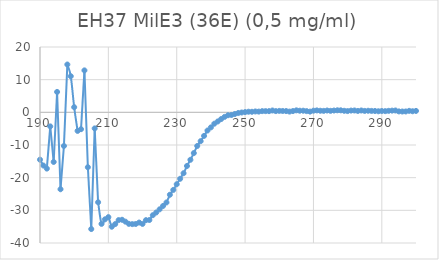
| Category | Series 0 |
|---|---|
| 300.0 | 0.434 |
| 299.0 | 0.333 |
| 298.0 | 0.453 |
| 297.0 | 0.268 |
| 296.0 | 0.253 |
| 295.0 | 0.283 |
| 294.0 | 0.562 |
| 293.0 | 0.522 |
| 292.0 | 0.46 |
| 291.0 | 0.37 |
| 290.0 | 0.409 |
| 289.0 | 0.327 |
| 288.0 | 0.41 |
| 287.0 | 0.438 |
| 286.0 | 0.484 |
| 285.0 | 0.439 |
| 284.0 | 0.565 |
| 283.0 | 0.428 |
| 282.0 | 0.567 |
| 281.0 | 0.538 |
| 280.0 | 0.386 |
| 279.0 | 0.468 |
| 278.0 | 0.617 |
| 277.0 | 0.626 |
| 276.0 | 0.554 |
| 275.0 | 0.46 |
| 274.0 | 0.56 |
| 273.0 | 0.45 |
| 272.0 | 0.486 |
| 271.0 | 0.59 |
| 270.0 | 0.504 |
| 269.0 | 0.223 |
| 268.0 | 0.378 |
| 267.0 | 0.495 |
| 266.0 | 0.495 |
| 265.0 | 0.607 |
| 264.0 | 0.387 |
| 263.0 | 0.23 |
| 262.0 | 0.389 |
| 261.0 | 0.413 |
| 260.0 | 0.44 |
| 259.0 | 0.376 |
| 258.0 | 0.56 |
| 257.0 | 0.361 |
| 256.0 | 0.366 |
| 255.0 | 0.368 |
| 254.0 | 0.226 |
| 253.0 | 0.263 |
| 252.0 | 0.168 |
| 251.0 | 0.189 |
| 250.0 | 0.073 |
| 249.0 | -0.053 |
| 248.0 | -0.197 |
| 247.0 | -0.514 |
| 246.0 | -0.811 |
| 245.0 | -0.896 |
| 244.0 | -1.393 |
| 243.0 | -2.061 |
| 242.0 | -2.797 |
| 241.0 | -3.478 |
| 240.0 | -4.607 |
| 239.0 | -5.567 |
| 238.0 | -7.209 |
| 237.0 | -8.823 |
| 236.0 | -10.294 |
| 235.0 | -12.473 |
| 234.0 | -14.531 |
| 233.0 | -16.421 |
| 232.0 | -18.644 |
| 231.0 | -20.337 |
| 230.0 | -22.005 |
| 229.0 | -23.746 |
| 228.0 | -25.227 |
| 227.0 | -27.596 |
| 226.0 | -28.657 |
| 225.0 | -29.688 |
| 224.0 | -30.663 |
| 223.0 | -31.49 |
| 222.0 | -32.96 |
| 221.0 | -33.013 |
| 220.0 | -34.153 |
| 219.0 | -33.743 |
| 218.0 | -34.176 |
| 217.0 | -34.221 |
| 216.0 | -34.138 |
| 215.0 | -33.466 |
| 214.0 | -32.885 |
| 213.0 | -32.99 |
| 212.0 | -34.204 |
| 211.0 | -35.017 |
| 210.0 | -32.084 |
| 209.0 | -32.759 |
| 208.0 | -34.144 |
| 207.0 | -27.52 |
| 206.0 | -4.92 |
| 205.0 | -35.729 |
| 204.0 | -16.801 |
| 203.0 | 12.84 |
| 202.0 | -5.158 |
| 201.0 | -5.682 |
| 200.0 | 1.582 |
| 199.0 | 11.056 |
| 198.0 | 14.64 |
| 197.0 | -10.296 |
| 196.0 | -23.544 |
| 195.0 | 6.246 |
| 194.0 | -15.186 |
| 193.0 | -4.302 |
| 192.0 | -17.222 |
| 191.0 | -16.286 |
| 190.0 | -14.491 |